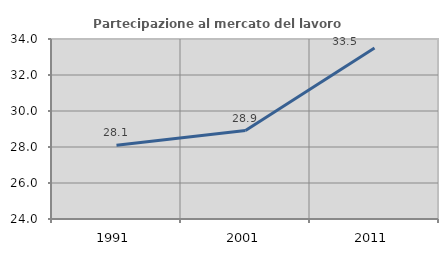
| Category | Partecipazione al mercato del lavoro  femminile |
|---|---|
| 1991.0 | 28.091 |
| 2001.0 | 28.916 |
| 2011.0 | 33.5 |